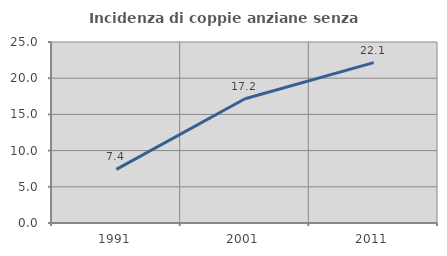
| Category | Incidenza di coppie anziane senza figli  |
|---|---|
| 1991.0 | 7.407 |
| 2001.0 | 17.16 |
| 2011.0 | 22.148 |